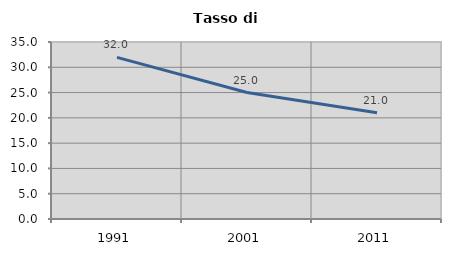
| Category | Tasso di disoccupazione   |
|---|---|
| 1991.0 | 31.955 |
| 2001.0 | 25.01 |
| 2011.0 | 21.022 |